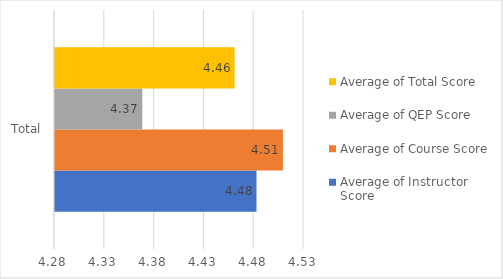
| Category | Average of Instructor Score | Average of Course Score | Average of QEP Score | Average of Total Score |
|---|---|---|---|---|
| Total | 4.482 | 4.509 | 4.368 | 4.46 |